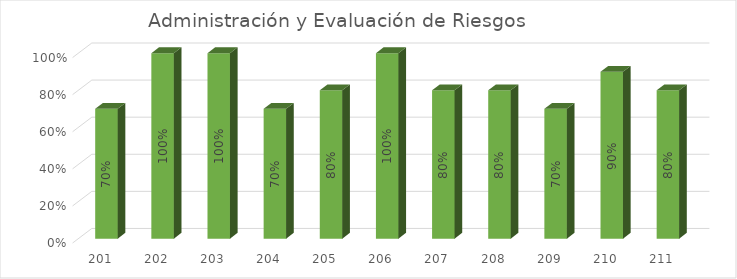
| Category | % Avance |
|---|---|
| 201.0 | 0.7 |
| 202.0 | 1 |
| 203.0 | 1 |
| 204.0 | 0.7 |
| 205.0 | 0.8 |
| 206.0 | 1 |
| 207.0 | 0.8 |
| 208.0 | 0.8 |
| 209.0 | 0.7 |
| 210.0 | 0.9 |
| 211.0 | 0.8 |